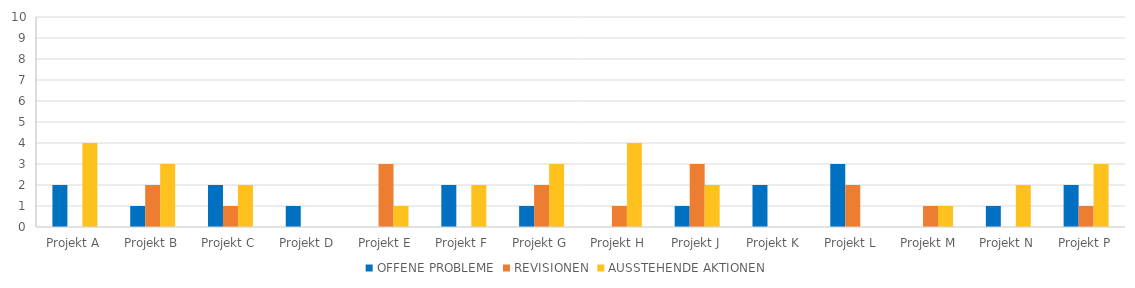
| Category | OFFENE PROBLEME | REVISIONEN | AUSSTEHENDE AKTIONEN |
|---|---|---|---|
| Projekt A | 2 | 0 | 4 |
| Projekt B | 1 | 2 | 3 |
| Projekt C | 2 | 1 | 2 |
| Projekt D | 1 | 0 | 0 |
| Projekt E | 0 | 3 | 1 |
| Projekt F | 2 | 0 | 2 |
| Projekt G | 1 | 2 | 3 |
| Projekt H | 0 | 1 | 4 |
| Projekt J | 1 | 3 | 2 |
| Projekt K | 2 | 0 | 0 |
| Projekt L | 3 | 2 | 0 |
| Projekt M | 0 | 1 | 1 |
| Projekt N | 1 | 0 | 2 |
| Projekt P | 2 | 1 | 3 |